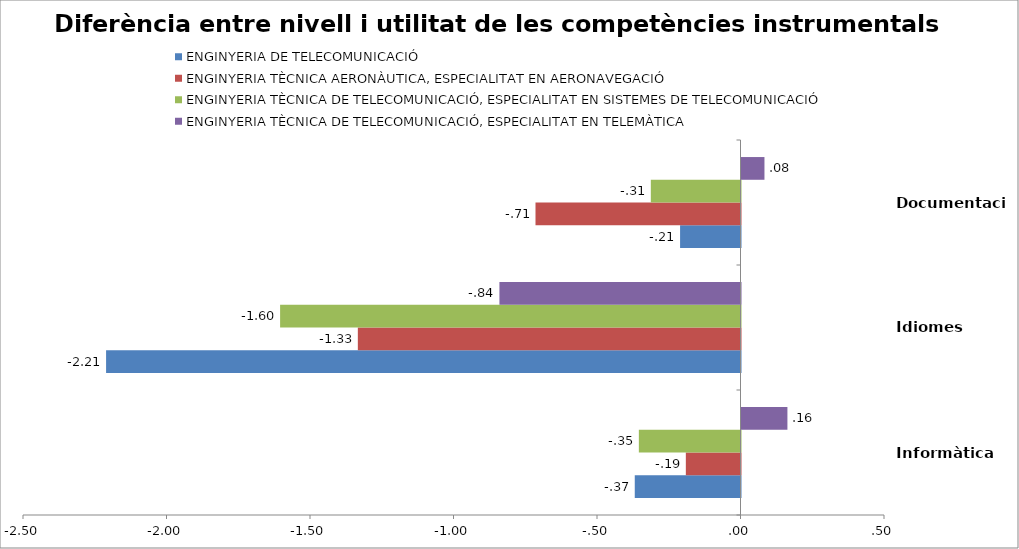
| Category | ENGINYERIA DE TELECOMUNICACIÓ | ENGINYERIA TÈCNICA AERONÀUTICA, ESPECIALITAT EN AERONAVEGACIÓ | ENGINYERIA TÈCNICA DE TELECOMUNICACIÓ, ESPECIALITAT EN SISTEMES DE TELECOMUNICACIÓ | ENGINYERIA TÈCNICA DE TELECOMUNICACIÓ, ESPECIALITAT EN TELEMÀTICA |
|---|---|---|---|---|
| Informàtica | -0.368 | -0.19 | -0.354 | 0.16 |
| Idiomes | -2.211 | -1.333 | -1.604 | -0.84 |
| Documentació | -0.211 | -0.714 | -0.313 | 0.08 |